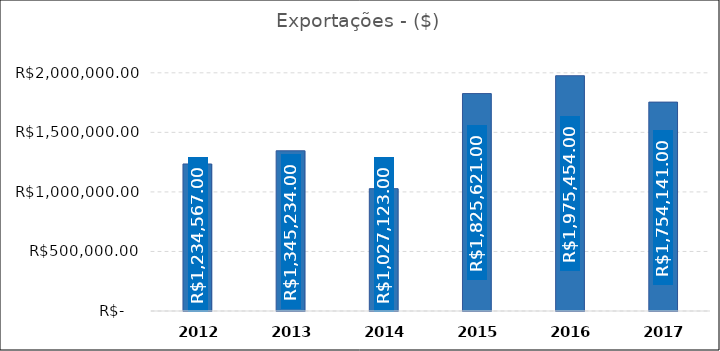
| Category | Exportações |
|---|---|
| 2012.0 | 1234567 |
| 2013.0 | 1345234 |
| 2014.0 | 1027123 |
| 2015.0 | 1825621 |
| 2016.0 | 1975454 |
| 2017.0 | 1754141 |